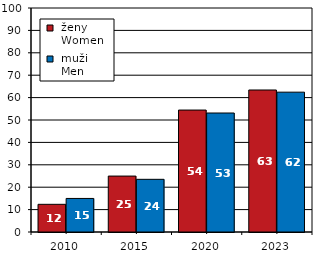
| Category |  ženy 
 Women |  muži 
 Men |
|---|---|---|
| 2010.0 | 12.36 | 14.98 |
| 2015.0 | 24.97 | 23.52 |
| 2020.0 | 54.438 | 53.12 |
| 2023.0 | 63.394 | 62.429 |